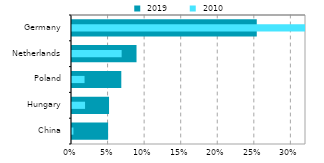
| Category |  2019 |
|---|---|
| China | 0.049 |
| Hungary | 0.051 |
| Poland | 0.067 |
| Netherlands | 0.088 |
| Germany | 0.253 |